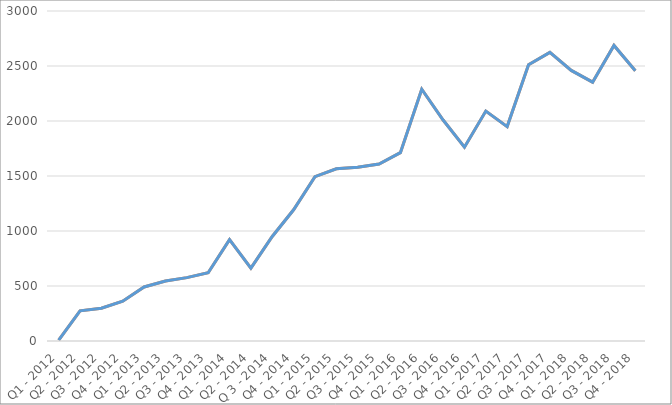
| Category | Anfragen |
|---|---|
| Q1 - 2012 | 8 |
| Q2 - 2012 | 274 |
| Q3 - 2012 | 298 |
| Q4 - 2012 | 362 |
| Q1 - 2013 | 491 |
| Q2 - 2013 | 546 |
| Q3 - 2013 | 576 |
| Q4 - 2013 | 621 |
| Q1 - 2014 | 922 |
| Q2 - 2014 | 663 |
| Q 3 - 2014 | 950 |
| Q4 - 2014 | 1193 |
| Q1 - 2015 | 1494 |
| Q2 - 2015 | 1566 |
| Q3 - 2015 | 1579 |
| Q4 - 2015 | 1609 |
| Q1 - 2016 | 1712 |
| Q2 - 2016 | 2289 |
| Q3 - 2016 | 2009 |
| Q4 - 2016 | 1762 |
| Q1 - 2017 | 2090 |
| Q2 - 2017 | 1949 |
| Q3 - 2017 | 2512 |
| Q4 - 2017 | 2624 |
| Q1 - 2018 | 2460 |
| Q2 - 2018 | 2353 |
| Q3 - 2018 | 2687 |
| Q4 - 2018 | 2456 |